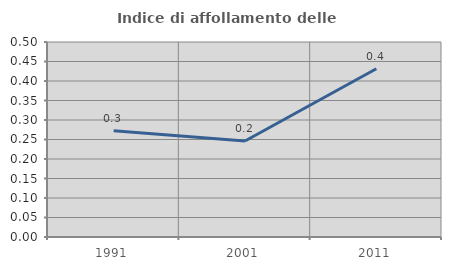
| Category | Indice di affollamento delle abitazioni  |
|---|---|
| 1991.0 | 0.272 |
| 2001.0 | 0.246 |
| 2011.0 | 0.431 |